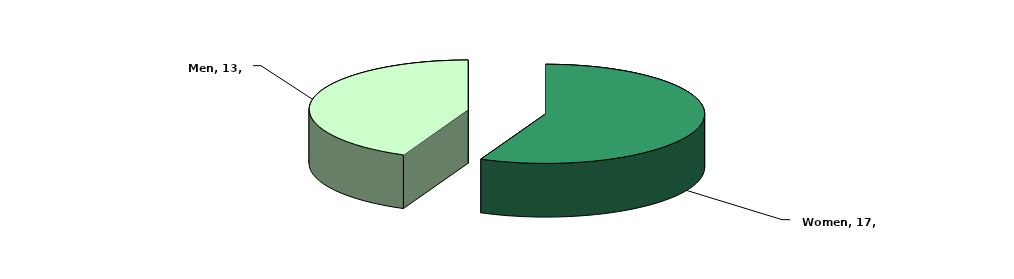
| Category | Series 0 |
|---|---|
| Women | 17 |
| Men | 13 |